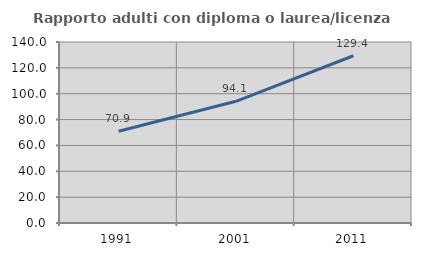
| Category | Rapporto adulti con diploma o laurea/licenza media  |
|---|---|
| 1991.0 | 70.916 |
| 2001.0 | 94.134 |
| 2011.0 | 129.366 |